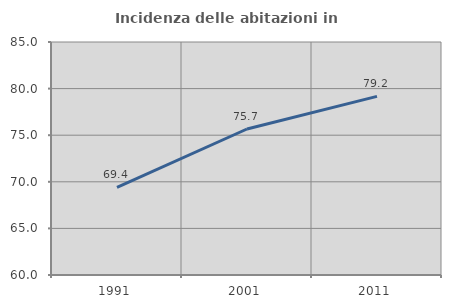
| Category | Incidenza delle abitazioni in proprietà  |
|---|---|
| 1991.0 | 69.404 |
| 2001.0 | 75.666 |
| 2011.0 | 79.165 |